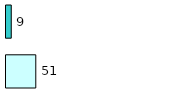
| Category | Series 0 | Series 1 |
|---|---|---|
| 0 | 51 | 9 |